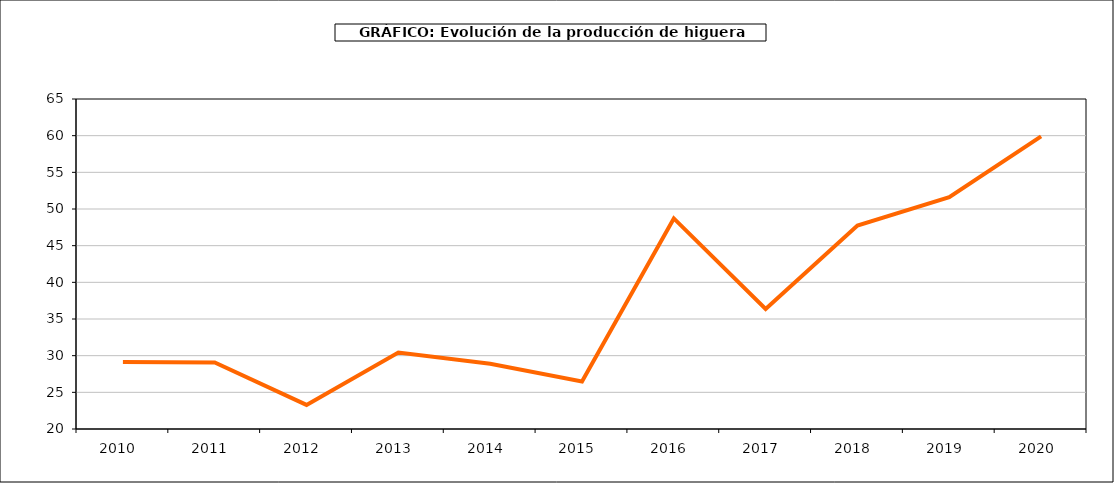
| Category | producción higuera |
|---|---|
| 2010.0 | 29.12 |
| 2011.0 | 29.071 |
| 2012.0 | 23.285 |
| 2013.0 | 30.434 |
| 2014.0 | 28.893 |
| 2015.0 | 26.479 |
| 2016.0 | 48.718 |
| 2017.0 | 36.38 |
| 2018.0 | 47.75 |
| 2019.0 | 51.598 |
| 2020.0 | 59.9 |